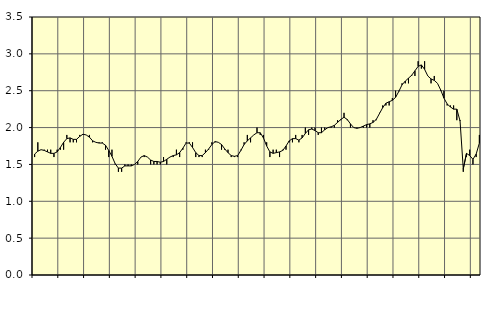
| Category | Piggar | Series 1 |
|---|---|---|
| nan | 1.6 | 1.64 |
| 87.0 | 1.8 | 1.68 |
| 87.0 | 1.7 | 1.7 |
| 87.0 | 1.7 | 1.69 |
| nan | 1.7 | 1.67 |
| 88.0 | 1.7 | 1.65 |
| 88.0 | 1.6 | 1.65 |
| 88.0 | 1.7 | 1.67 |
| nan | 1.7 | 1.73 |
| 89.0 | 1.7 | 1.8 |
| 89.0 | 1.9 | 1.85 |
| 89.0 | 1.8 | 1.86 |
| nan | 1.8 | 1.84 |
| 90.0 | 1.8 | 1.84 |
| 90.0 | 1.9 | 1.88 |
| 90.0 | 1.9 | 1.91 |
| nan | 1.9 | 1.9 |
| 91.0 | 1.9 | 1.87 |
| 91.0 | 1.8 | 1.82 |
| 91.0 | 1.8 | 1.8 |
| nan | 1.8 | 1.79 |
| 92.0 | 1.8 | 1.79 |
| 92.0 | 1.7 | 1.76 |
| 92.0 | 1.6 | 1.69 |
| nan | 1.7 | 1.61 |
| 93.0 | 1.5 | 1.51 |
| 93.0 | 1.4 | 1.45 |
| 93.0 | 1.4 | 1.45 |
| nan | 1.5 | 1.48 |
| 94.0 | 1.5 | 1.48 |
| 94.0 | 1.5 | 1.48 |
| 94.0 | 1.5 | 1.5 |
| nan | 1.5 | 1.54 |
| 95.0 | 1.6 | 1.6 |
| 95.0 | 1.6 | 1.62 |
| 95.0 | 1.6 | 1.6 |
| nan | 1.5 | 1.56 |
| 96.0 | 1.5 | 1.54 |
| 96.0 | 1.5 | 1.54 |
| 96.0 | 1.5 | 1.53 |
| nan | 1.6 | 1.54 |
| 97.0 | 1.5 | 1.57 |
| 97.0 | 1.6 | 1.6 |
| 97.0 | 1.6 | 1.62 |
| nan | 1.7 | 1.63 |
| 98.0 | 1.6 | 1.66 |
| 98.0 | 1.7 | 1.72 |
| 98.0 | 1.8 | 1.79 |
| nan | 1.8 | 1.79 |
| 99.0 | 1.8 | 1.73 |
| 99.0 | 1.6 | 1.66 |
| 99.0 | 1.6 | 1.62 |
| nan | 1.6 | 1.62 |
| 0.0 | 1.7 | 1.66 |
| 0.0 | 1.7 | 1.71 |
| 0.0 | 1.8 | 1.77 |
| nan | 1.8 | 1.81 |
| 1.0 | 1.8 | 1.8 |
| 1.0 | 1.7 | 1.77 |
| 1.0 | 1.7 | 1.71 |
| nan | 1.7 | 1.66 |
| 2.0 | 1.6 | 1.62 |
| 2.0 | 1.6 | 1.61 |
| 2.0 | 1.6 | 1.62 |
| nan | 1.7 | 1.69 |
| 3.0 | 1.8 | 1.77 |
| 3.0 | 1.9 | 1.82 |
| 3.0 | 1.8 | 1.86 |
| nan | 1.9 | 1.9 |
| 4.0 | 2 | 1.93 |
| 4.0 | 1.9 | 1.93 |
| 4.0 | 1.9 | 1.86 |
| nan | 1.8 | 1.75 |
| 5.0 | 1.6 | 1.67 |
| 5.0 | 1.7 | 1.65 |
| 5.0 | 1.7 | 1.66 |
| nan | 1.6 | 1.67 |
| 6.0 | 1.7 | 1.69 |
| 6.0 | 1.7 | 1.75 |
| 6.0 | 1.8 | 1.82 |
| nan | 1.8 | 1.85 |
| 7.0 | 1.9 | 1.85 |
| 7.0 | 1.8 | 1.83 |
| 7.0 | 1.9 | 1.86 |
| nan | 2 | 1.92 |
| 8.0 | 1.9 | 1.97 |
| 8.0 | 2 | 1.98 |
| 8.0 | 2 | 1.96 |
| nan | 1.9 | 1.93 |
| 9.0 | 2 | 1.93 |
| 9.0 | 2 | 1.97 |
| 9.0 | 2 | 2 |
| nan | 2 | 2.01 |
| 10.0 | 2 | 2.03 |
| 10.0 | 2.1 | 2.07 |
| 10.0 | 2.1 | 2.11 |
| nan | 2.2 | 2.14 |
| 11.0 | 2.1 | 2.11 |
| 11.0 | 2 | 2.05 |
| 11.0 | 2 | 2 |
| nan | 2 | 1.99 |
| 12.0 | 2 | 2 |
| 12.0 | 2 | 2.02 |
| 12.0 | 2 | 2.04 |
| nan | 2 | 2.05 |
| 13.0 | 2.1 | 2.07 |
| 13.0 | 2.1 | 2.11 |
| 13.0 | 2.2 | 2.19 |
| nan | 2.3 | 2.27 |
| 14.0 | 2.3 | 2.33 |
| 14.0 | 2.3 | 2.35 |
| 14.0 | 2.4 | 2.37 |
| nan | 2.5 | 2.41 |
| 15.0 | 2.5 | 2.49 |
| 15.0 | 2.6 | 2.58 |
| 15.0 | 2.6 | 2.63 |
| nan | 2.6 | 2.67 |
| 16.0 | 2.7 | 2.71 |
| 16.0 | 2.7 | 2.77 |
| 16.0 | 2.9 | 2.83 |
| nan | 2.8 | 2.85 |
| 17.0 | 2.9 | 2.79 |
| 17.0 | 2.7 | 2.7 |
| 17.0 | 2.6 | 2.66 |
| nan | 2.7 | 2.64 |
| 18.0 | 2.6 | 2.6 |
| 18.0 | 2.5 | 2.51 |
| 18.0 | 2.5 | 2.4 |
| nan | 2.3 | 2.32 |
| 19.0 | 2.3 | 2.28 |
| 19.0 | 2.3 | 2.25 |
| 19.0 | 2.1 | 2.25 |
| nan | 2.1 | 2.09 |
| 20.0 | 1.4 | 1.44 |
| 20.0 | 1.6 | 1.65 |
| 20.0 | 1.7 | 1.62 |
| nan | 1.5 | 1.57 |
| 21.0 | 1.6 | 1.64 |
| 21.0 | 1.9 | 1.79 |